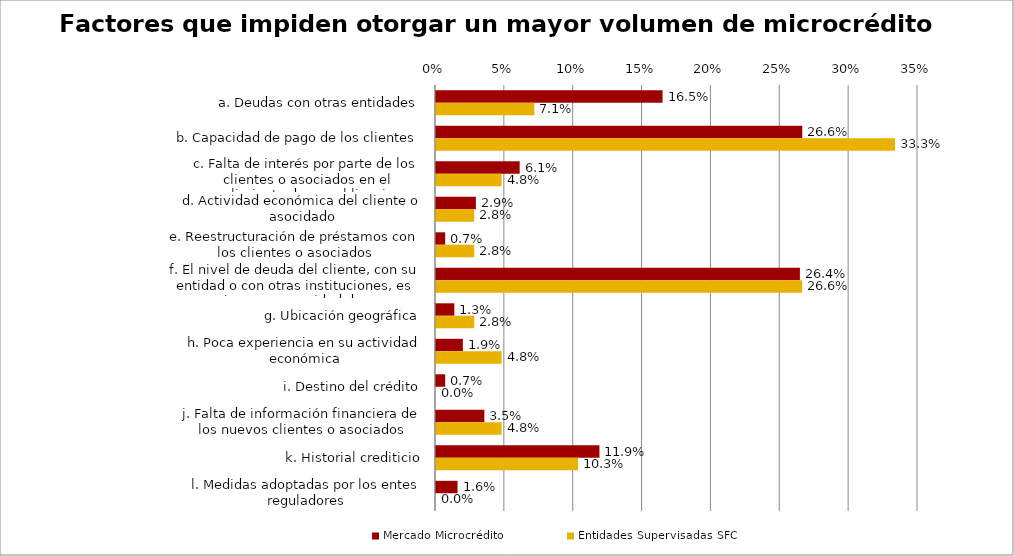
| Category | Mercado Microcrédito | Entidades Supervisadas SFC |
|---|---|---|
| a. Deudas con otras entidades | 0.165 | 0.071 |
| b. Capacidad de pago de los clientes | 0.266 | 0.333 |
| c. Falta de interés por parte de los clientes o asociados en el cumplimiento de sus obligaciones | 0.061 | 0.048 |
| d. Actividad económica del cliente o asocidado | 0.029 | 0.028 |
| e. Reestructuración de préstamos con los clientes o asociados | 0.007 | 0.028 |
| f. El nivel de deuda del cliente, con su entidad o con otras instituciones, es superior a su capacidad de pago (sobrendeudamiento) | 0.264 | 0.266 |
| g. Ubicación geográfica | 0.013 | 0.028 |
| h. Poca experiencia en su actividad económica | 0.019 | 0.048 |
| i. Destino del crédito | 0.007 | 0 |
| j. Falta de información financiera de los nuevos clientes o asociados | 0.035 | 0.048 |
| k. Historial crediticio | 0.119 | 0.103 |
| l. Medidas adoptadas por los entes reguladores | 0.016 | 0 |